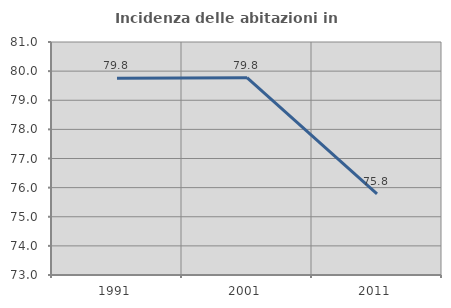
| Category | Incidenza delle abitazioni in proprietà  |
|---|---|
| 1991.0 | 79.754 |
| 2001.0 | 79.773 |
| 2011.0 | 75.788 |